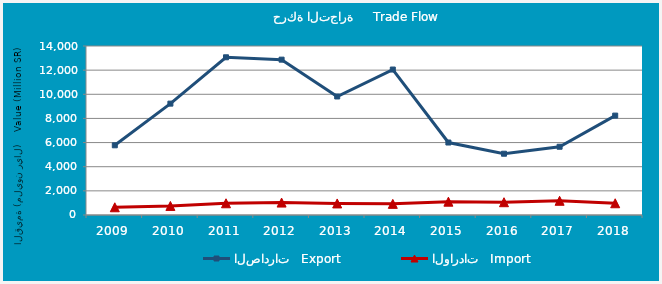
| Category | الصادرات   Export | الواردات   Import |
|---|---|---|
| 2009.0 | 5773469192 | 639666020 |
| 2010.0 | 9225763121 | 749702614 |
| 2011.0 | 13064417923 | 971814953 |
| 2012.0 | 12869968946 | 1030288842 |
| 2013.0 | 9818477808 | 957638426 |
| 2014.0 | 12049905492 | 921790514 |
| 2015.0 | 6003817733 | 1103973735 |
| 2016.0 | 5075331815 | 1059370888 |
| 2017.0 | 5654349323 | 1177697115 |
| 2018.0 | 8233714010 | 973161386 |